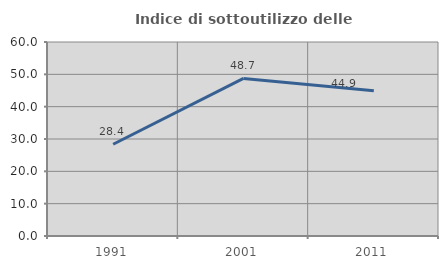
| Category | Indice di sottoutilizzo delle abitazioni  |
|---|---|
| 1991.0 | 28.378 |
| 2001.0 | 48.734 |
| 2011.0 | 44.898 |